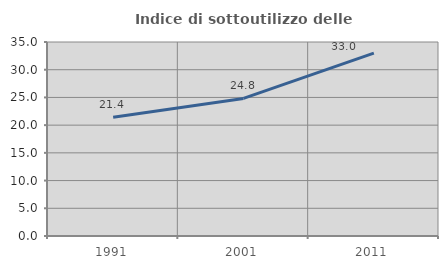
| Category | Indice di sottoutilizzo delle abitazioni  |
|---|---|
| 1991.0 | 21.429 |
| 2001.0 | 24.821 |
| 2011.0 | 32.987 |